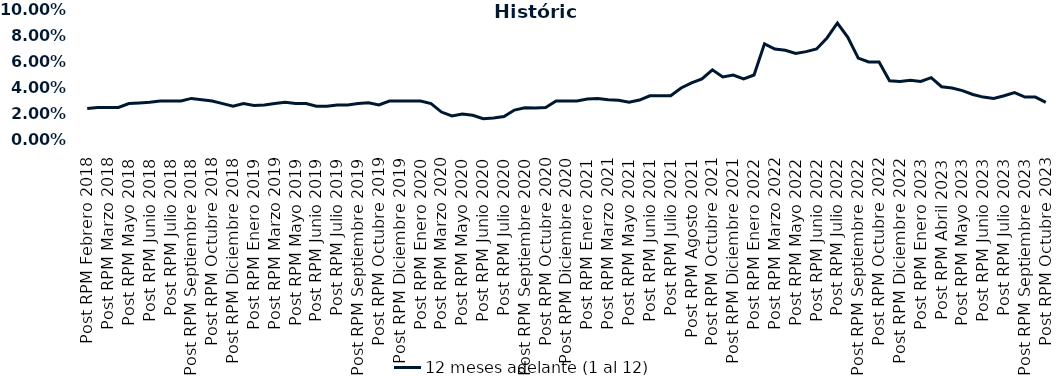
| Category | 12 meses adelante (1 al 12)  |
|---|---|
| Post RPM Febrero 2018 | 0.024 |
| Pre RPM Marzo 2018 | 0.025 |
| Post RPM Marzo 2018 | 0.025 |
| Pre RPM Mayo 2018 | 0.025 |
| Post RPM Mayo 2018 | 0.028 |
| Pre RPM Junio 2018 | 0.028 |
| Post RPM Junio 2018 | 0.029 |
| Pre RPM Julio 2018 | 0.03 |
| Post RPM Julio 2018 | 0.03 |
| Pre RPM Septiembre 2018 | 0.03 |
| Post RPM Septiembre 2018 | 0.032 |
| Pre RPM Octubre 2018 | 0.031 |
| Post RPM Octubre 2018 | 0.03 |
| Pre RPM Diciembre 2018 | 0.028 |
| Post RPM Diciembre 2018 | 0.026 |
| Pre RPM Enero 2019 | 0.028 |
| Post RPM Enero 2019 | 0.026 |
| Pre RPM Marzo 2019 | 0.027 |
| Post RPM Marzo 2019 | 0.028 |
| Pre RPM Mayo 2019 | 0.029 |
| Post RPM Mayo 2019 | 0.028 |
| Pre RPM Junio 2019 | 0.028 |
| Post RPM Junio 2019 | 0.026 |
| Pre RPM Julio 2019 | 0.026 |
| Post RPM Julio 2019 | 0.027 |
| Pre RPM Septiembre 2019 | 0.027 |
| Post RPM Septiembre 2019 | 0.028 |
| Pre RPM Octubre 2019 | 0.029 |
| Post RPM Octubre 2019 | 0.027 |
| Pre RPM Diciembre 2019 | 0.03 |
| Post RPM Diciembre 2019 | 0.03 |
| Pre RPM Enero 2020 | 0.03 |
| Post RPM Enero 2020 | 0.03 |
| Pre RPM Marzo 2020 | 0.028 |
| Post RPM Marzo 2020 | 0.022 |
| Pre RPM Mayo 2020 | 0.018 |
| Post RPM Mayo 2020 | 0.02 |
| Pre RPM Junio 2020 | 0.019 |
| Post RPM Junio 2020 | 0.016 |
| Pre RPM Julio 2020 | 0.017 |
| Post RPM Julio 2020 | 0.018 |
| Pre RPM Septiembre 2020 | 0.023 |
| Post RPM Septiembre 2020 | 0.025 |
| Pre RPM Octubre 2020 | 0.025 |
| Post RPM Octubre 2020 | 0.025 |
| Pre RPM Diciembre 2020 | 0.03 |
| Post RPM Diciembre 2020 | 0.03 |
| Pre RPM Enero 2021 | 0.03 |
| Post RPM Enero 2021 | 0.032 |
| Pre RPM Marzo 2021 | 0.032 |
| Post RPM Marzo 2021 | 0.031 |
| Pre RPM Mayo 2021 | 0.03 |
| Post RPM Mayo 2021 | 0.029 |
| Pre RPM Junio 2021 | 0.031 |
| Post RPM Junio 2021 | 0.034 |
| Pre RPM Julio 2021 | 0.034 |
| Post RPM Julio 2021 | 0.034 |
| Pre RPM Agosto 2021 | 0.04 |
| Post RPM Agosto 2021 | 0.044 |
| Pre RPM Octubre 2021 | 0.047 |
| Post RPM Octubre 2021 | 0.054 |
| Pre RPM Diciembre 2021 | 0.048 |
| Post RPM Diciembre 2021 | 0.05 |
| Pre RPM Enero 2022 | 0.047 |
| Post RPM Enero 2022 | 0.05 |
| Pre RPM Marzo 2022 | 0.074 |
| Post RPM Marzo 2022 | 0.07 |
| Pre RPM Mayo 2022 | 0.069 |
| Post RPM Mayo 2022 | 0.066 |
| Pre RPM Junio 2022 | 0.068 |
| Post RPM Junio 2022 | 0.07 |
| Pre RPM Julio 2022 | 0.078 |
| Post RPM Julio 2022 | 0.09 |
| Pre RPM Septiembre 2022 | 0.079 |
| Post RPM Septiembre 2022 | 0.063 |
| Pre RPM Octubre 2022 | 0.06 |
| Post RPM Octubre 2022 | 0.06 |
| Pre RPM Diciembre 2022 | 0.046 |
| Post RPM Diciembre 2022 | 0.045 |
| Pre RPM Enero 2023 | 0.046 |
| Post RPM Enero 2023 | 0.045 |
| Pre RPM Abril 2023 | 0.048 |
| Post RPM Abril 2023 | 0.041 |
| Pre RPM Mayo 2023 | 0.04 |
| Post RPM Mayo 2023 | 0.038 |
| Pre RPM Junio 2023 | 0.035 |
| Post RPM Junio 2023 | 0.033 |
| Pre RPM Julio 2023 | 0.032 |
| Post RPM Julio 2023 | 0.034 |
| Pre RPM Septiembre 2023 | 0.036 |
| Post RPM Septiembre 2023 | 0.033 |
| Pre RPM Octubre 2023 | 0.033 |
| Post RPM Octubre 2023 | 0.029 |